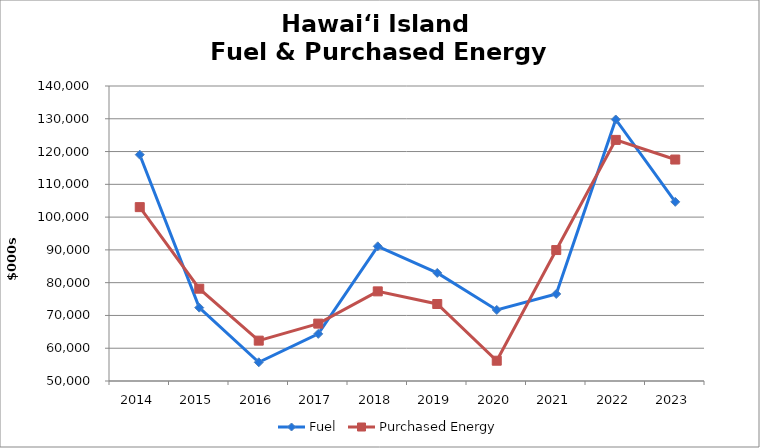
| Category | Fuel | Purchased Energy |
|---|---|---|
| 2014.0 | 119048 | 103044.2 |
| 2015.0 | 72374.6 | 78160.3 |
| 2016.0 | 55708 | 62310 |
| 2017.0 | 64377.5 | 67506.7 |
| 2018.0 | 91086.6 | 77343.5 |
| 2019.0 | 82964.2 | 73490.6 |
| 2020.0 | 71675 | 56188 |
| 2021.0 | 76555.809 | 89947.398 |
| 2022.0 | 129782.8 | 123558.3 |
| 2023.0 | 104661 | 117565 |